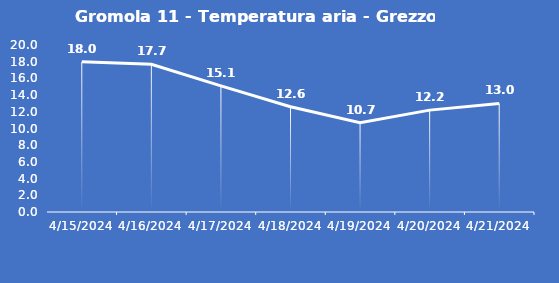
| Category | Gromola 11 - Temperatura aria - Grezzo (°C) |
|---|---|
| 4/15/24 | 18 |
| 4/16/24 | 17.7 |
| 4/17/24 | 15.1 |
| 4/18/24 | 12.6 |
| 4/19/24 | 10.7 |
| 4/20/24 | 12.2 |
| 4/21/24 | 13 |